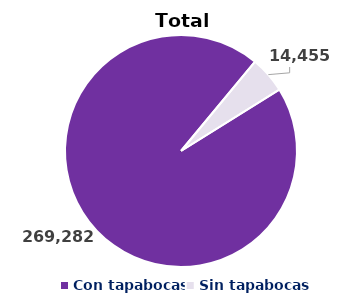
| Category | Series 0 |
|---|---|
| Con tapabocas  | 269282 |
| Sin tapabocas | 14455 |